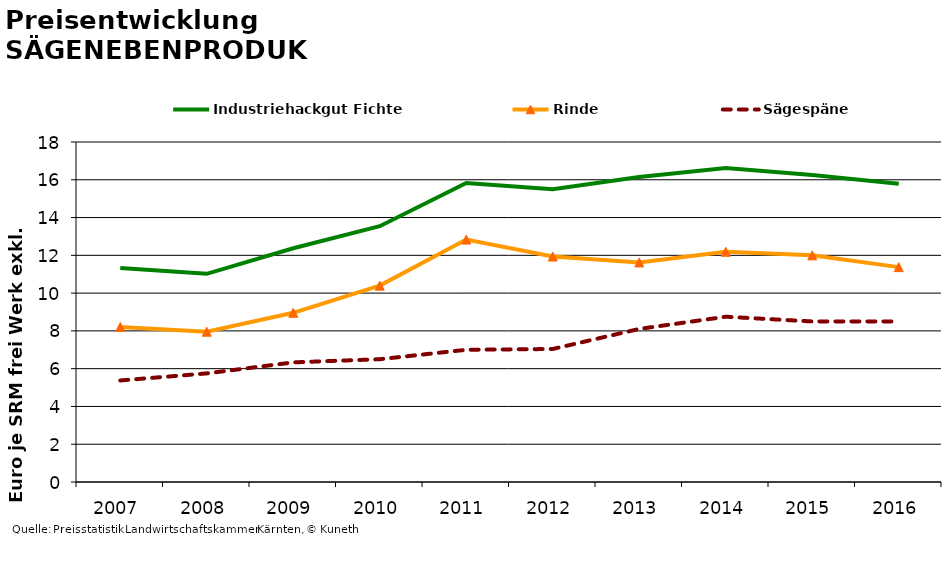
| Category | Industriehackgut Fichte | Rinde | Sägespäne |
|---|---|---|---|
| 2007.0 | 11.333 | 8.208 | 5.375 |
| 2008.0 | 11.021 | 7.958 | 5.75 |
| 2009.0 | 12.375 | 8.958 | 6.333 |
| 2010.0 | 13.542 | 10.396 | 6.5 |
| 2011.0 | 15.833 | 12.833 | 7 |
| 2012.0 | 15.5 | 11.938 | 7.042 |
| 2013.0 | 16.146 | 11.625 | 8.104 |
| 2014.0 | 16.625 | 12.188 | 8.75 |
| 2015.0 | 16.25 | 12 | 8.5 |
| 2016.0 | 15.792 | 11.375 | 8.5 |